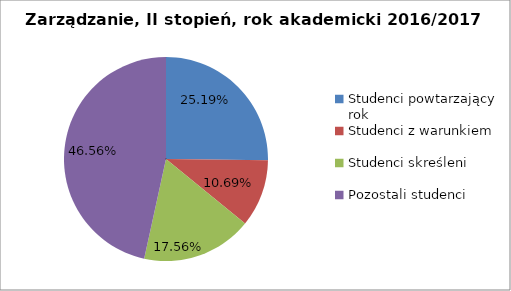
| Category | Series 0 |
|---|---|
| Studenci powtarzający rok | 33 |
| Studenci z warunkiem | 14 |
| Studenci skreśleni | 23 |
| Pozostali studenci | 61 |